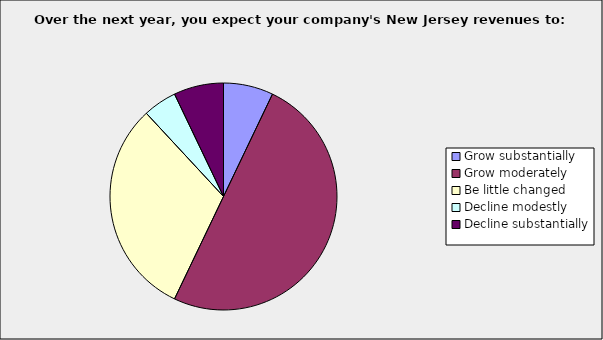
| Category | Series 0 |
|---|---|
| Grow substantially | 0.071 |
| Grow moderately | 0.5 |
| Be little changed | 0.31 |
| Decline modestly | 0.048 |
| Decline substantially | 0.071 |